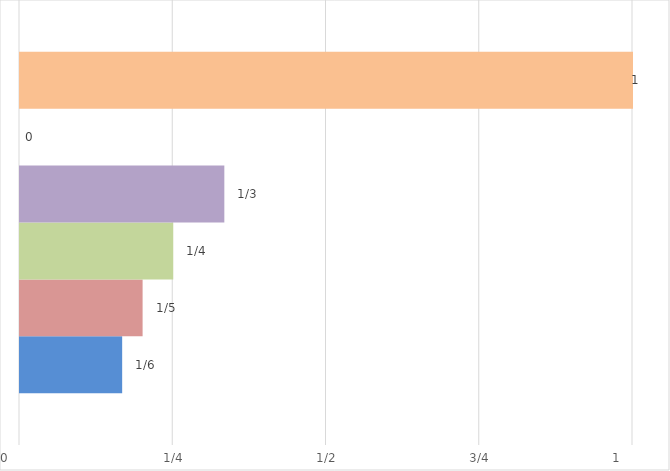
| Category | Series 0 | Series 1 | Series 2 | Series 3 | Series 4 | Series 5 |
|---|---|---|---|---|---|---|
| 0 | 0.167 | 0.2 | 0.25 | 0.333 | 0 | 1 |